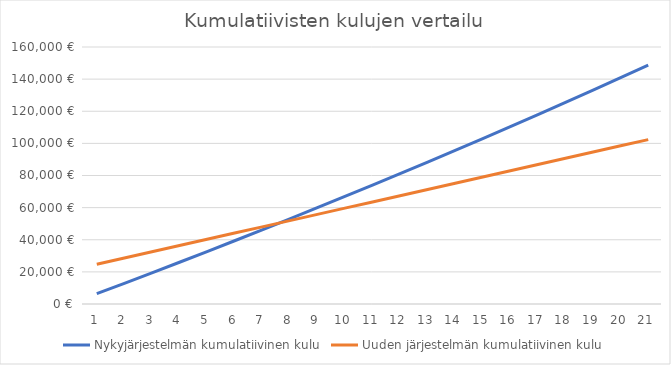
| Category | Nykyjärjestelmän kumulatiivinen kulu | Uuden järjestelmän kumulatiivinen kulu |
|---|---|---|
| 0 | 6400 | 24750 |
| 1 | 12864 | 28630 |
| 2 | 19392.64 | 32510 |
| 3 | 25986.566 | 36390 |
| 4 | 32646.432 | 40270 |
| 5 | 39372.896 | 44150 |
| 6 | 46166.625 | 48030 |
| 7 | 53028.292 | 51910 |
| 8 | 59958.575 | 55790 |
| 9 | 66958.16 | 59670 |
| 10 | 74027.742 | 63550 |
| 11 | 81168.019 | 67430 |
| 12 | 88379.699 | 71310 |
| 13 | 95663.496 | 75190 |
| 14 | 103020.131 | 79070 |
| 15 | 110450.333 | 82950 |
| 16 | 117954.836 | 86830 |
| 17 | 125534.384 | 90710 |
| 18 | 133189.728 | 94590 |
| 19 | 140921.626 | 98470 |
| 20 | 148730.842 | 102350 |